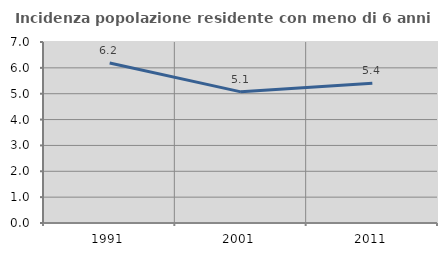
| Category | Incidenza popolazione residente con meno di 6 anni |
|---|---|
| 1991.0 | 6.187 |
| 2001.0 | 5.072 |
| 2011.0 | 5.409 |